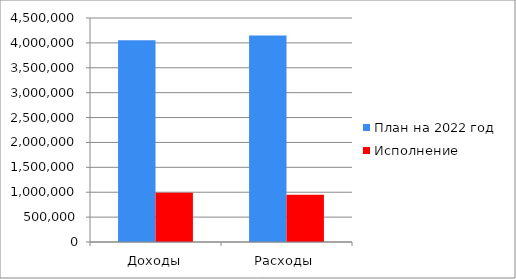
| Category | План на 2022 год | Исполнение |
|---|---|---|
| Доходы | 4052801 | 989323 |
| Расходы | 4148083 | 946923 |